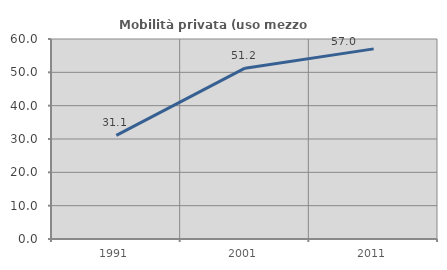
| Category | Mobilità privata (uso mezzo privato) |
|---|---|
| 1991.0 | 31.108 |
| 2001.0 | 51.248 |
| 2011.0 | 57.035 |